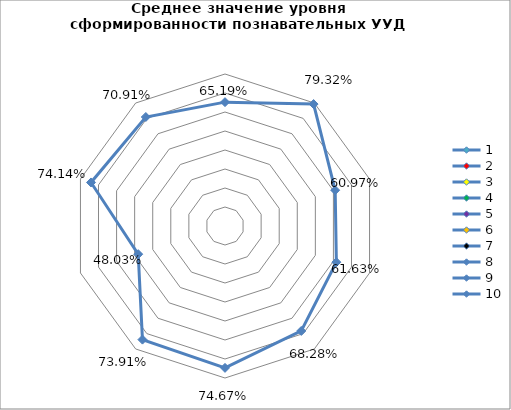
| Category | Series 0 |
|---|---|
| 0 | 0.652 |
| 1 | 0.793 |
| 2 | 0.61 |
| 3 | 0.616 |
| 4 | 0.683 |
| 5 | 0.747 |
| 6 | 0.739 |
| 7 | 0.48 |
| 8 | 0.741 |
| 9 | 0.709 |